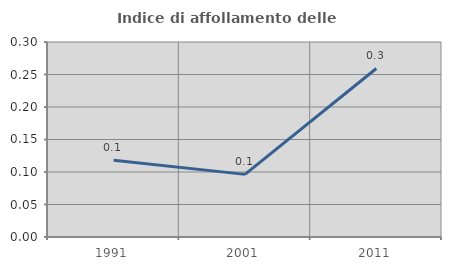
| Category | Indice di affollamento delle abitazioni  |
|---|---|
| 1991.0 | 0.118 |
| 2001.0 | 0.096 |
| 2011.0 | 0.259 |